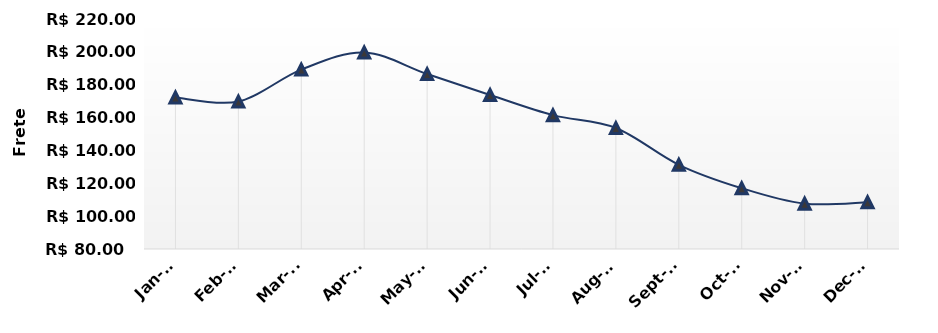
| Category | Frete Rodoviário (R$/t) |
|---|---|
| 2016-01-01 | 172.24 |
| 2016-02-01 | 169.747 |
| 2016-03-01 | 189.2 |
| 2016-04-01 | 199.6 |
| 2016-05-01 | 186.5 |
| 2016-06-01 | 173.775 |
| 2016-07-01 | 161.47 |
| 2016-08-01 | 153.639 |
| 2016-09-01 | 131.259 |
| 2016-10-01 | 117 |
| 2016-11-01 | 107.6 |
| 2016-12-01 | 108.5 |